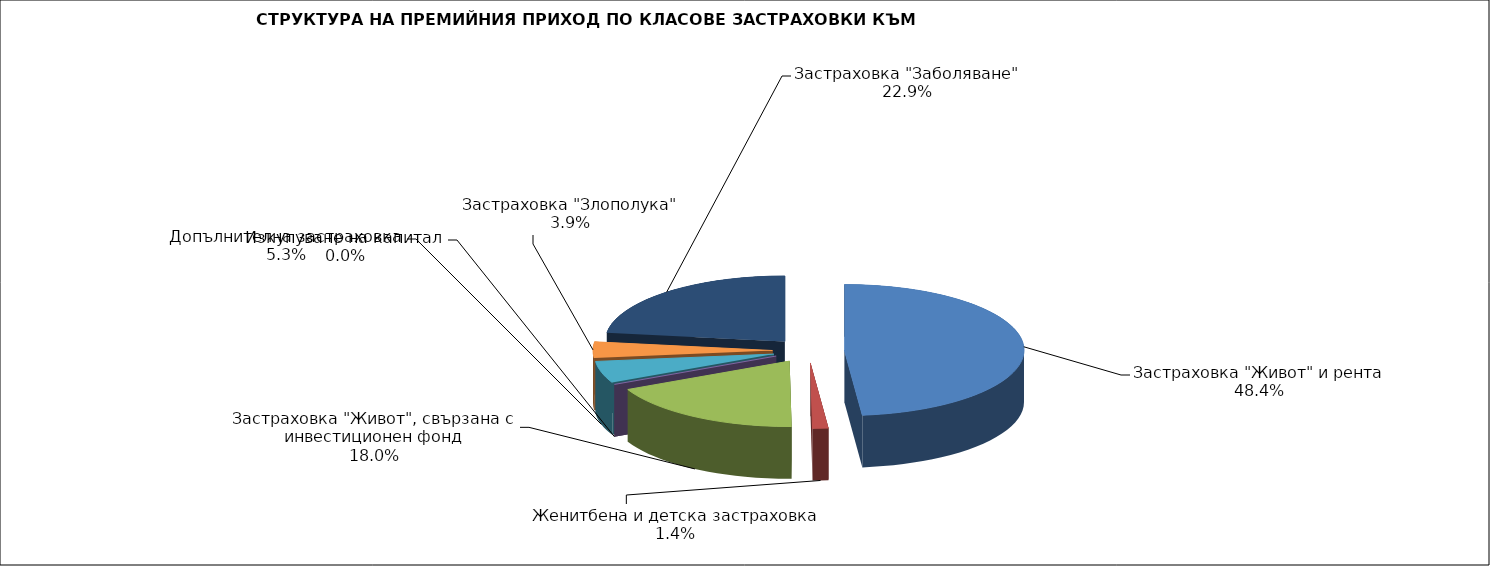
| Category | Series 0 |
|---|---|
| Застраховка "Живот" и рента | 87855867.055 |
| Женитбена и детска застраховка | 2570853.262 |
| Застраховка "Живот", свързана с инвестиционен фонд | 32723579.888 |
| Изкупуване на капитал | 0 |
| Допълнителна застраховка | 9710185.487 |
| Застраховка "Злополука" | 7123730.127 |
| Застраховка "Заболяване" | 41518267.86 |